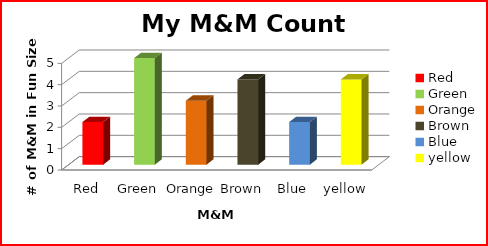
| Category | Series 0 |
|---|---|
| Red | 2 |
| Green | 5 |
| Orange | 3 |
| Brown | 4 |
| Blue | 2 |
| yellow | 4 |